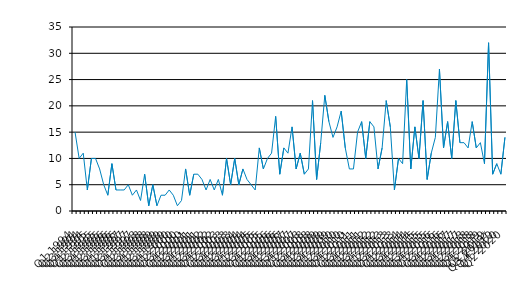
| Category | Series 0 |
|---|---|
| Q1 1994 | 15 |
| Q2 1994 | 10 |
| Q3 1994 | 11 |
| Q4 1994 | 4 |
| Q1 1995 | 10 |
| Q2 1995 | 10 |
| Q3 1995 | 8 |
| Q4 1995 | 5 |
| Q1 1996 | 3 |
| Q2 1996 | 9 |
| Q3 1996 | 4 |
| Q4 1996 | 4 |
| Q1 1997 | 4 |
| Q2 1997 | 5 |
| Q3 1997 | 3 |
| Q4 1997 | 4 |
| Q1 1998 | 2 |
| Q2 1998 | 7 |
| Q3 1998 | 1 |
| Q4 1998 | 5 |
| Q1 1999 | 1 |
| Q2 1999 | 3 |
| Q3 1999 | 3 |
| Q4 1999 | 4 |
| Q1 2000 | 3 |
| Q2 2000 | 1 |
| Q3 2000 | 2 |
| Q4 2000 | 8 |
| Q1 2001 | 3 |
| Q2 2001 | 7 |
| Q3 2001 | 7 |
| Q4 2001 | 6 |
| Q1 2002 | 4 |
| Q2 2002 | 6 |
| Q3 2002 | 4 |
| Q4 2002 | 6 |
| Q1 2003 | 3 |
| Q2 2003 | 10 |
| Q3 2003 | 5 |
| Q4 2003 | 10 |
| Q1 2004 | 5 |
| Q2 2004 | 8 |
| Q3 2004 | 6 |
| Q4 2004 | 5 |
| Q1 2005 | 4 |
| Q2 2005 | 12 |
| Q3 2005 | 8 |
| Q4 2005 | 10 |
| Q1 2006 | 11 |
| Q2 2006 | 18 |
| Q3 2006 | 7 |
| Q4 2006 | 12 |
| Q1 2007 | 11 |
| Q2 2007 | 16 |
| Q3 2007 | 8 |
| Q4 2007 | 11 |
| Q1 2008 | 7 |
| Q2 2008 | 8 |
| Q3 2008 | 21 |
| Q4 2008 | 6 |
| Q1 2009 | 13 |
| Q2 2009 | 22 |
| Q3 2009 | 17 |
| Q4 2009 | 14 |
| Q1 2010 | 16 |
| Q2 2010 | 19 |
| Q3 2010 | 12 |
| Q4 2010 | 8 |
| Q1 2011 | 8 |
| Q2 2011 | 15 |
| Q3 2011 | 17 |
| Q4 2011 | 10 |
| Q1 2012 | 17 |
| Q2 2012 | 16 |
| Q3 2012 | 8 |
| Q4 2012 | 12 |
| Q1 2013 | 21 |
| Q2 2013 | 16 |
| Q3 2013 | 4 |
| Q4 2013 | 10 |
| Q1 2014 | 9 |
| Q2 2014 | 25 |
| Q3 2014 | 8 |
| Q4 2014 | 16 |
| Q1 2015 | 10 |
| Q2 2015 | 21 |
| Q3 2015 | 6 |
| Q4 2015 | 11 |
| Q1 2016 | 14 |
| Q2 2016 | 27 |
| Q3 2016 | 12 |
| Q4 2016 | 17 |
| Q1 2017 | 10 |
| Q2 2017 | 21 |
| Q3 2017 | 13 |
| Q4 2017 | 13 |
| Q1 2018 | 12 |
| Q2 2018 | 17 |
| Q3 2018 | 12 |
| Q4 2018 | 13 |
| Q1 2019 | 9 |
| Q2 2019 | 32 |
| Q3 2019* | 7 |
| Q4 2019 | 9 |
| Q1 2020 | 7 |
| Q2 2021 | 14 |